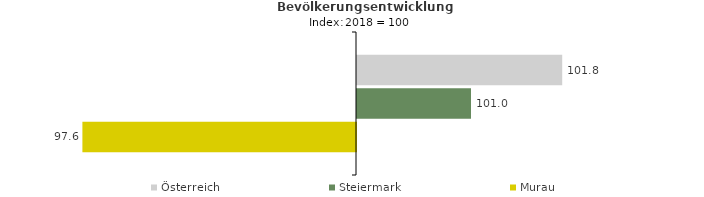
| Category | Österreich | Steiermark | Murau |
|---|---|---|---|
| 2022.0 | 101.8 | 101 | 97.6 |